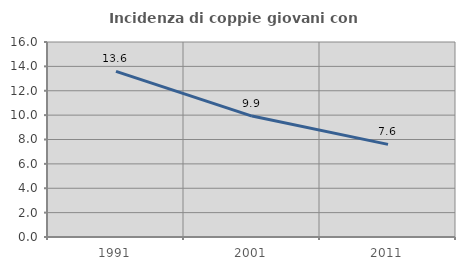
| Category | Incidenza di coppie giovani con figli |
|---|---|
| 1991.0 | 13.595 |
| 2001.0 | 9.921 |
| 2011.0 | 7.6 |